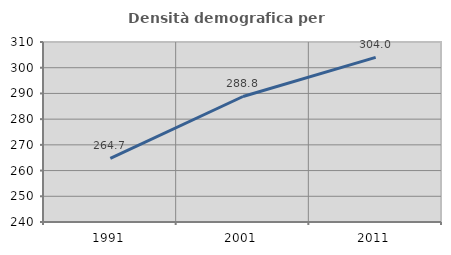
| Category | Densità demografica |
|---|---|
| 1991.0 | 264.733 |
| 2001.0 | 288.808 |
| 2011.0 | 304.036 |